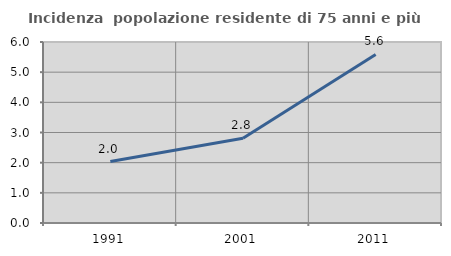
| Category | Incidenza  popolazione residente di 75 anni e più |
|---|---|
| 1991.0 | 2.037 |
| 2001.0 | 2.806 |
| 2011.0 | 5.588 |